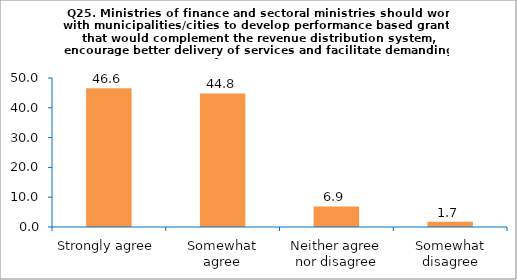
| Category | Series 0 |
|---|---|
| Strongly agree | 46.552 |
| Somewhat agree | 44.828 |
| Neither agree nor disagree | 6.897 |
| Somewhat disagree | 1.724 |